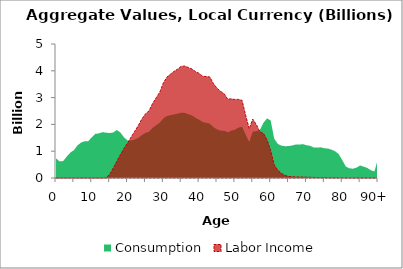
| Category | Consumption | Labor Income |
|---|---|---|
| 0 | 731.782 | 0 |
|  | 619.468 | 0 |
| 2 | 632.101 | 0 |
| 3 | 799.561 | 0 |
| 4 | 947.424 | 0 |
| 5 | 1039.526 | 0 |
| 6 | 1215.562 | 0 |
| 7 | 1321.912 | 0 |
| 8 | 1372.281 | 0 |
| 9 | 1372.994 | 0 |
| 10 | 1519.957 | 0 |
| 11 | 1646.671 | 0 |
| 12 | 1666.437 | 0.015 |
| 13 | 1709.947 | 0 |
| 14 | 1691.198 | 10.332 |
| 15 | 1678.913 | 133.288 |
| 16 | 1698.057 | 366.049 |
| 17 | 1791.377 | 621.15 |
| 18 | 1697.691 | 872.079 |
| 19 | 1518.067 | 1104.046 |
| 20 | 1402.242 | 1302.416 |
| 21 | 1398.383 | 1526.32 |
| 22 | 1435.131 | 1742.867 |
| 23 | 1498.022 | 1955.845 |
| 24 | 1599.984 | 2200.825 |
| 25 | 1682.559 | 2391.655 |
| 26 | 1728.523 | 2508.645 |
| 27 | 1875.713 | 2779.034 |
| 28 | 1969.828 | 2993.212 |
| 29 | 2061.292 | 3200.764 |
| 30 | 2226.857 | 3543.653 |
| 31 | 2312.363 | 3764.143 |
| 32 | 2345.418 | 3876.428 |
| 33 | 2370.525 | 3980.14 |
| 34 | 2402.28 | 4062.652 |
| 35 | 2437.4 | 4164.919 |
| 36 | 2429.155 | 4175.964 |
| 37 | 2380.778 | 4121.702 |
| 38 | 2332.074 | 4067.378 |
| 39 | 2244.047 | 3969.387 |
| 40 | 2176.399 | 3903.055 |
| 41 | 2087.953 | 3794.956 |
| 42 | 2058.212 | 3786.823 |
| 43 | 2028.06 | 3767.501 |
| 44 | 1898.743 | 3525.979 |
| 45 | 1815.916 | 3350.029 |
| 46 | 1768.221 | 3231.509 |
| 47 | 1766.263 | 3143.388 |
| 48 | 1704.173 | 2942.32 |
| 49 | 1768.011 | 2953.656 |
| 50 | 1800.149 | 2929.99 |
| 51 | 1880.091 | 2933.621 |
| 52 | 1916.825 | 2898.501 |
| 53 | 1622.629 | 2346.598 |
| 54 | 1346.812 | 1840.421 |
| 55 | 1735.677 | 2197.632 |
| 56 | 1741.497 | 1992.191 |
| 57 | 1799.526 | 1721.888 |
| 58 | 2063.245 | 1663.311 |
| 59 | 2224.973 | 1420.394 |
| 60 | 2144.251 | 1028.766 |
| 61 | 1462.356 | 489.783 |
| 62 | 1272.823 | 288.716 |
| 63 | 1208.079 | 171.344 |
| 64 | 1186.19 | 96.314 |
| 65 | 1191.973 | 60.222 |
| 66 | 1214.232 | 46.583 |
| 67 | 1248.632 | 40.265 |
| 68 | 1245.713 | 37.351 |
| 69 | 1263.211 | 36.557 |
| 70 | 1223.151 | 30.815 |
| 71 | 1202.047 | 27.382 |
| 72 | 1142.096 | 22.004 |
| 73 | 1140.79 | 18.736 |
| 74 | 1143.026 | 16.366 |
| 75 | 1111.285 | 15.002 |
| 76 | 1098.838 | 11.327 |
| 77 | 1057.78 | 8.896 |
| 78 | 998.727 | 6.45 |
| 79 | 894.759 | 4.142 |
| 80 | 672.149 | 1.858 |
| 81 | 427.398 | 1.056 |
| 82 | 362.417 | 0.829 |
| 83 | 346.907 | 0.762 |
| 84 | 388.393 | 0.665 |
| 85 | 467.207 | 0.555 |
| 86 | 422.178 | 0.465 |
| 87 | 376.84 | 0.534 |
| 88 | 289.485 | 0.656 |
| 89 | 247.025 | 0.907 |
| 90+ | 714.721 | 3.576 |